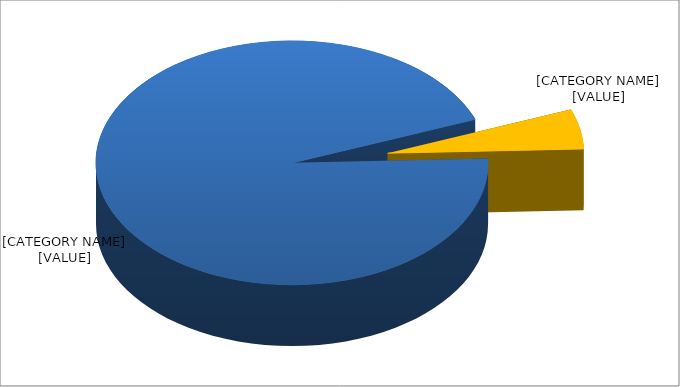
| Category | Percent |
|---|---|
| Public | 0.947 |
| Federal | 0.053 |